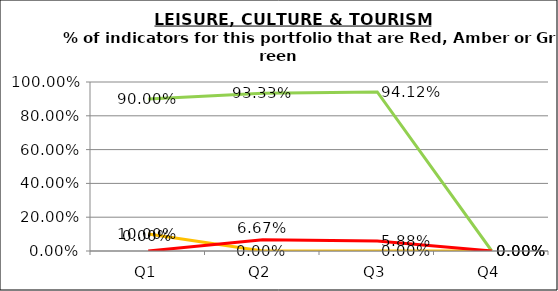
| Category | Green | Amber | Red |
|---|---|---|---|
| Q1 | 0.9 | 0.1 | 0 |
| Q2 | 0.933 | 0 | 0.067 |
| Q3 | 0.941 | 0 | 0.059 |
| Q4 | 0 | 0 | 0 |